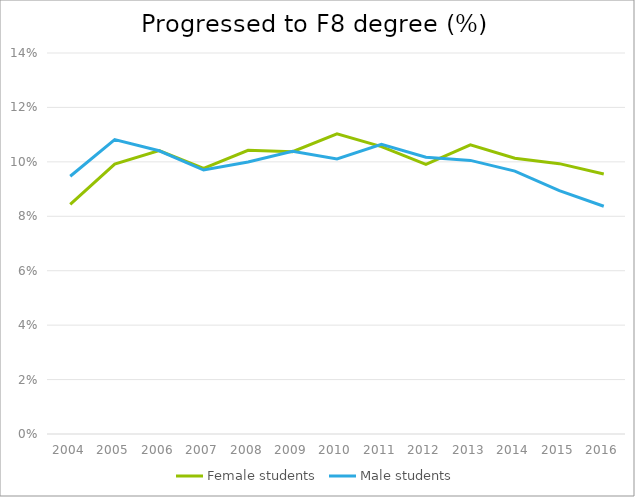
| Category | Female students | Male students |
|---|---|---|
| 2004.0 | 0.084 | 0.095 |
| 2005.0 | 0.099 | 0.108 |
| 2006.0 | 0.104 | 0.104 |
| 2007.0 | 0.098 | 0.097 |
| 2008.0 | 0.104 | 0.1 |
| 2009.0 | 0.104 | 0.104 |
| 2010.0 | 0.11 | 0.101 |
| 2011.0 | 0.106 | 0.106 |
| 2012.0 | 0.099 | 0.102 |
| 2013.0 | 0.106 | 0.101 |
| 2014.0 | 0.101 | 0.097 |
| 2015.0 | 0.099 | 0.089 |
| 2016.0 | 0.096 | 0.084 |